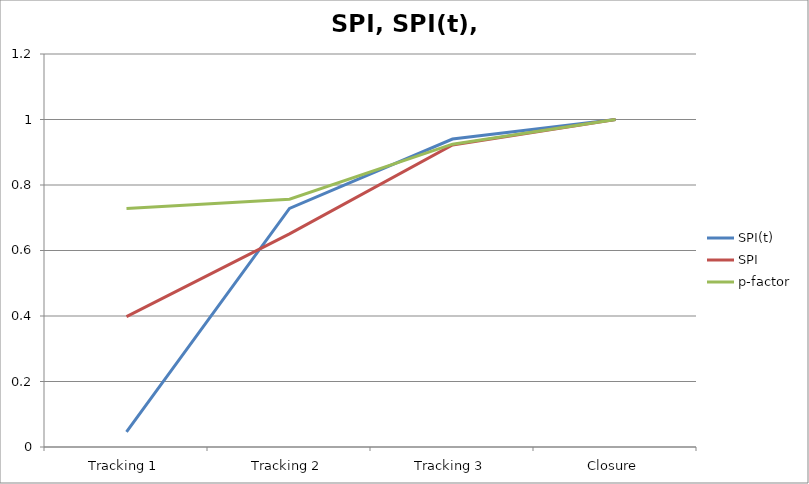
| Category | SPI(t) | SPI | p-factor |
|---|---|---|---|
| Tracking 1 | 0.046 | 0.398 | 0.729 |
| Tracking 2 | 0.728 | 0.651 | 0.757 |
| Tracking 3 | 0.94 | 0.922 | 0.925 |
| Closure | 1 | 1 | 1 |